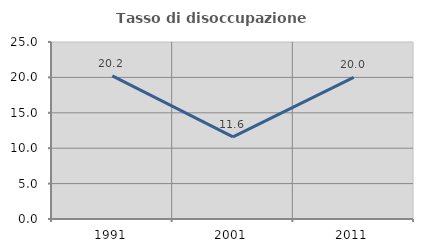
| Category | Tasso di disoccupazione giovanile  |
|---|---|
| 1991.0 | 20.213 |
| 2001.0 | 11.594 |
| 2011.0 | 20 |